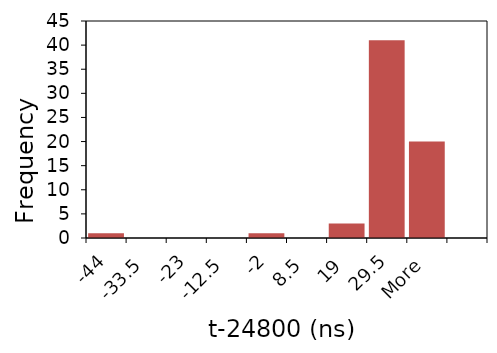
| Category | Series 1 |
|---|---|
| -44 | 1 |
| -33.5 | 0 |
| -23 | 0 |
| -12.5 | 0 |
| -2 | 1 |
| 8.5 | 0 |
| 19 | 3 |
| 29.5 | 41 |
| More | 20 |